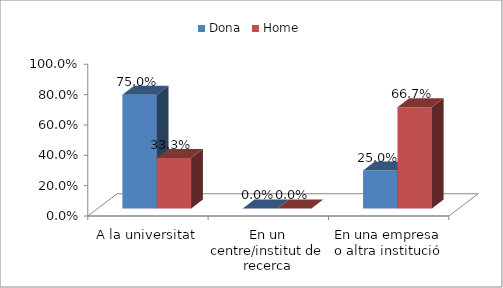
| Category | Dona | Home |
|---|---|---|
| A la universitat | 0.75 | 0.333 |
| En un centre/institut de recerca | 0 | 0 |
| En una empresa o altra institució | 0.25 | 0.667 |